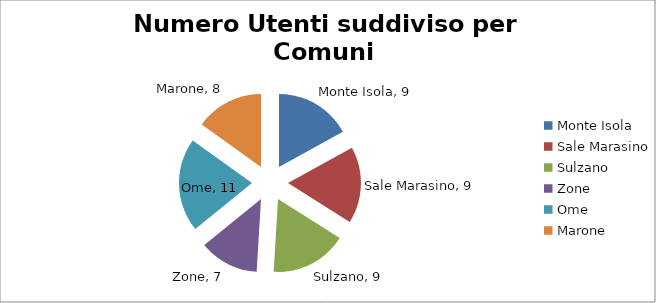
| Category | Series 0 |
|---|---|
| Monte Isola | 9 |
| Sale Marasino | 9 |
| Sulzano | 9 |
| Zone | 7 |
| Ome | 11 |
| Marone | 8 |